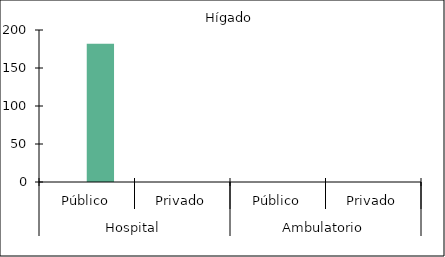
| Category |   |    Hígado |
|---|---|---|
| 0 | 0 | 182 |
| 1 | 0 | 0 |
| 2 | 0 | 0 |
| 3 | 0 | 0 |